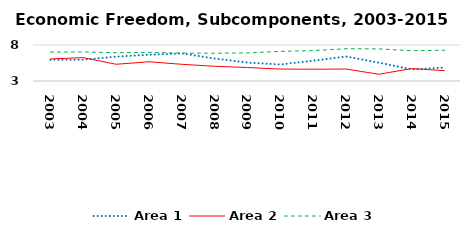
| Category | Area 1 | Area 2 | Area 3 |
|---|---|---|---|
| 2003.0 | 5.95 | 6.066 | 7.021 |
| 2004.0 | 5.96 | 6.245 | 7.027 |
| 2005.0 | 6.384 | 5.324 | 6.937 |
| 2006.0 | 6.647 | 5.671 | 6.976 |
| 2007.0 | 6.837 | 5.318 | 6.87 |
| 2008.0 | 6.122 | 5.045 | 6.857 |
| 2009.0 | 5.554 | 4.868 | 6.912 |
| 2010.0 | 5.296 | 4.66 | 7.111 |
| 2011.0 | 5.818 | 4.637 | 7.221 |
| 2012.0 | 6.406 | 4.663 | 7.481 |
| 2013.0 | 5.549 | 3.937 | 7.46 |
| 2014.0 | 4.615 | 4.722 | 7.205 |
| 2015.0 | 4.872 | 4.441 | 7.279 |